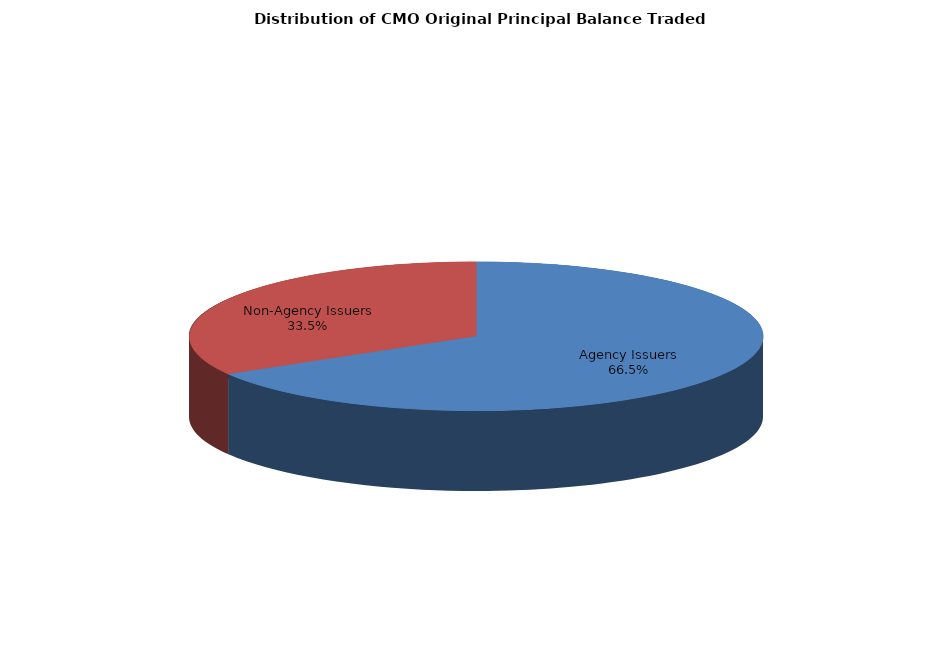
| Category | Series 0 |
|---|---|
| Agency Issuers | 7331104284.348 |
| Non-Agency Issuers | 3686404309.123 |